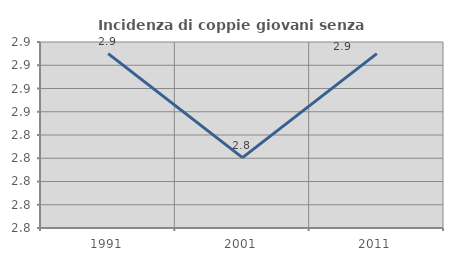
| Category | Incidenza di coppie giovani senza figli |
|---|---|
| 1991.0 | 2.91 |
| 2001.0 | 2.821 |
| 2011.0 | 2.91 |